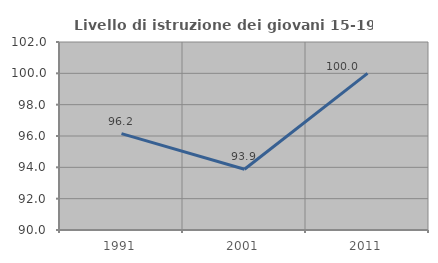
| Category | Livello di istruzione dei giovani 15-19 anni |
|---|---|
| 1991.0 | 96.154 |
| 2001.0 | 93.878 |
| 2011.0 | 100 |